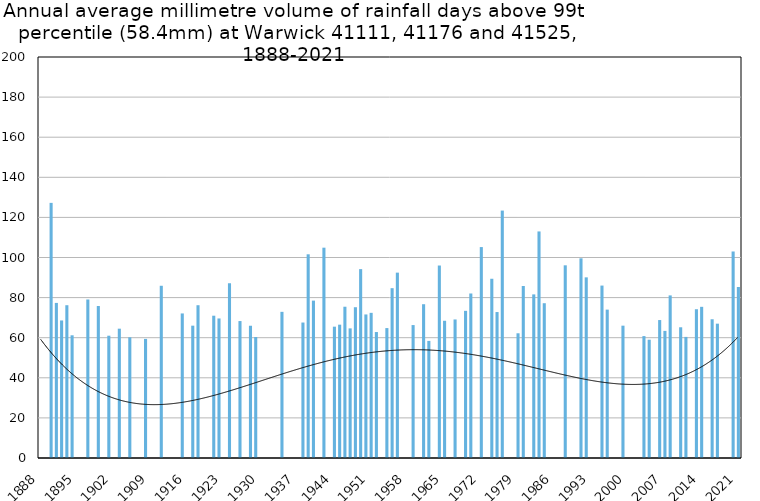
| Category | Annual average mm in days above 99th percentile |
|---|---|
| 1888 | 0 |
| 1889 | 0 |
| 1890 | 127.25 |
| 1891 | 77.35 |
| 1892 | 68.6 |
| 1893 | 76.2 |
| 1894 | 61.2 |
| 1895 | 0 |
| 1896 | 0 |
| 1897 | 79.067 |
| 1898 | 0 |
| 1899 | 75.8 |
| 1900 | 0 |
| 1901 | 61 |
| 1902 | 0 |
| 1903 | 64.5 |
| 1904 | 0 |
| 1905 | 60.2 |
| 1906 | 0 |
| 1907 | 0 |
| 1908 | 59.4 |
| 1909 | 0 |
| 1910 | 0 |
| 1911 | 85.9 |
| 1912 | 0 |
| 1913 | 0 |
| 1914 | 0 |
| 1915 | 72.1 |
| 1916 | 0 |
| 1917 | 66 |
| 1918 | 76.2 |
| 1919 | 0 |
| 1920 | 0 |
| 1921 | 70.967 |
| 1922 | 69.6 |
| 1923 | 0 |
| 1924 | 87.1 |
| 1925 | 0 |
| 1926 | 68.3 |
| 1927 | 0 |
| 1928 | 66 |
| 1929 | 60.35 |
| 1930 | 0 |
| 1931 | 0 |
| 1932 | 0 |
| 1933 | 0 |
| 1934 | 72.9 |
| 1935 | 0 |
| 1936 | 0 |
| 1937 | 0 |
| 1938 | 67.567 |
| 1939 | 101.6 |
| 1940 | 78.5 |
| 1941 | 0 |
| 1942 | 104.9 |
| 1943 | 0 |
| 1944 | 65.5 |
| 1945 | 66.5 |
| 1946 | 75.45 |
| 1947 | 64.65 |
| 1948 | 75.2 |
| 1949 | 94.2 |
| 1950 | 71.6 |
| 1951 | 72.4 |
| 1952 | 62.825 |
| 1953 | 0 |
| 1954 | 64.8 |
| 1955 | 84.7 |
| 1956 | 92.45 |
| 1957 | 0 |
| 1958 | 0 |
| 1959 | 66.3 |
| 1960 | 0 |
| 1961 | 76.7 |
| 1962 | 58.4 |
| 1963 | 0 |
| 1964 | 96 |
| 1965 | 68.45 |
| 1966 | 0 |
| 1967 | 69.1 |
| 1968 | 0 |
| 1969 | 73.4 |
| 1970 | 82.05 |
| 1971 | 0 |
| 1972 | 105.2 |
| 1973 | 0 |
| 1974 | 89.4 |
| 1975 | 72.8 |
| 1976 | 123.4 |
| 1977 | 0 |
| 1978 | 0 |
| 1979 | 62.2 |
| 1980 | 85.8 |
| 1981 | 0 |
| 1982 | 81.6 |
| 1983 | 113 |
| 1984 | 77.2 |
| 1985 | 0 |
| 1986 | 0 |
| 1987 | 0 |
| 1988 | 96.1 |
| 1989 | 0 |
| 1990 | 0 |
| 1991 | 99.6 |
| 1992 | 90.1 |
| 1993 | 0 |
| 1994 | 0 |
| 1995 | 86 |
| 1996 | 74 |
| 1997 | 0 |
| 1998 | 0 |
| 1999 | 66 |
| 2000 | 0 |
| 2001 | 0 |
| 2002 | 0 |
| 2003 | 60.8 |
| 2004 | 59 |
| 2005 | 0 |
| 2006 | 68.8 |
| 2007 | 63.4 |
| 2008 | 81.1 |
| 2009 | 0 |
| 2010 | 65.2 |
| 2011 | 60.4 |
| 2012 | 0 |
| 2013 | 74.2 |
| 2014 | 75.4 |
| 2015 | 0 |
| 2016 | 69.2 |
| 2017 | 67 |
| 2018 | 0 |
| 2019 | 0 |
| 2020 | 103 |
| 2021 | 85.3 |